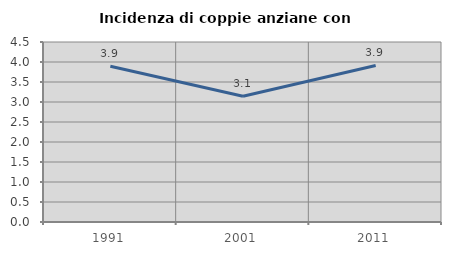
| Category | Incidenza di coppie anziane con figli |
|---|---|
| 1991.0 | 3.894 |
| 2001.0 | 3.144 |
| 2011.0 | 3.913 |